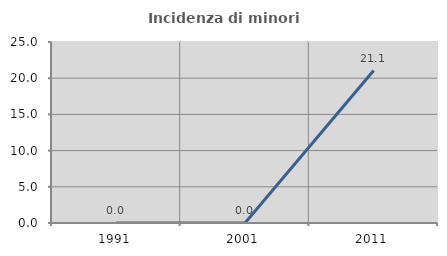
| Category | Incidenza di minori stranieri |
|---|---|
| 1991.0 | 0 |
| 2001.0 | 0 |
| 2011.0 | 21.053 |